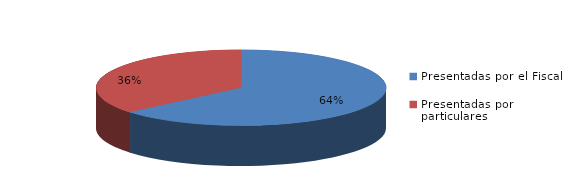
| Category | Series 0 |
|---|---|
| Presentadas por el Fiscal | 367 |
| Presentadas por particulares | 208 |